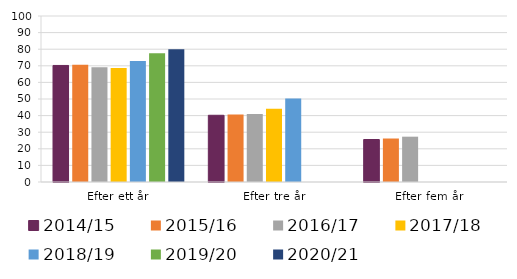
| Category | 2014/15 | 2015/16 | 2016/17 | 2017/18 | 2018/19 | 2019/20 | 2020/21 |
|---|---|---|---|---|---|---|---|
| Efter ett år | 70.2 | 70.6 | 69.1 | 68.7 | 72.9 | 77.6 | 80 |
| Efter tre år | 40.2 | 40.6 | 40.9 | 44.2 | 50.3 | 0 | 0 |
| Efter fem år | 25.6 | 26.2 | 27.3 | 0 | 0 | 0 | 0 |